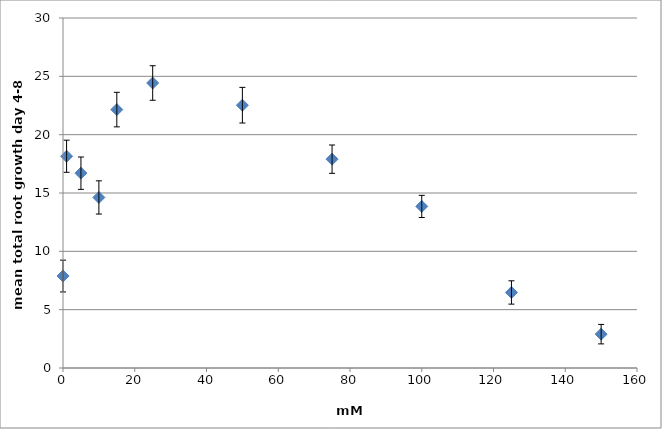
| Category | Series 0 |
|---|---|
| 0.0 | 7.882 |
| 1.0 | 18.15 |
| 5.0 | 16.7 |
| 10.0 | 14.619 |
| 15.0 | 22.15 |
| 25.0 | 24.429 |
| 50.0 | 22.526 |
| 75.0 | 17.9 |
| 100.0 | 13.85 |
| 125.0 | 6.474 |
| 150.0 | 2.9 |